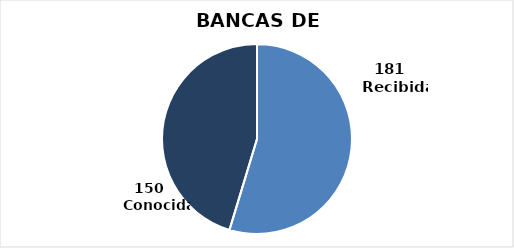
| Category | Series 0 |
|---|---|
| 0 | 181 |
| 1 | 150 |